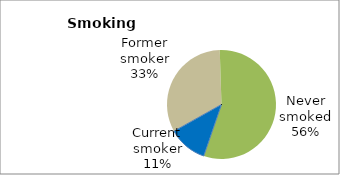
| Category | Series 0 |
|---|---|
| Current smoker | 11.588 |
| Former smoker | 32.623 |
| Never smoked | 55.789 |